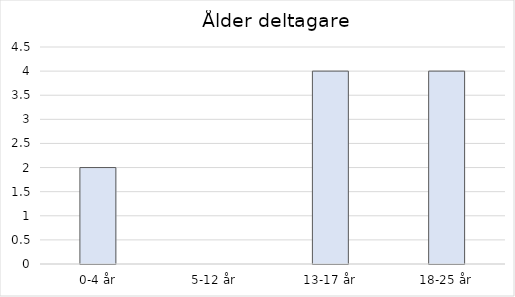
| Category | Series 0 |
|---|---|
| 0-4 år | 2 |
| 5-12 år | 0 |
| 13-17 år | 4 |
| 18-25 år | 4 |